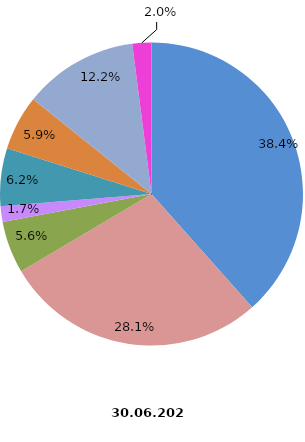
| Category | Anzahl Beschäftigte 2020 |
|---|---|
| Elektroinstallation | 5986 |
| Gas-, Wasser-, Heizungs- sowie Lüftungs- und Klimainstallation | 4369 |
| Sonstige Bauinstallation | 865 |
| Anbringen von Stuckaturen, Gipserei und Verputzerei | 261 |
| Bautischlerei und -schlosserei | 959 |
| Fußboden-, Fliesen- und Plattenlegerei, Tapeziererei | 914 |
| Malerei und Glaserei | 1904 |
| Sonstiger Ausbau a. n. g. | 316 |